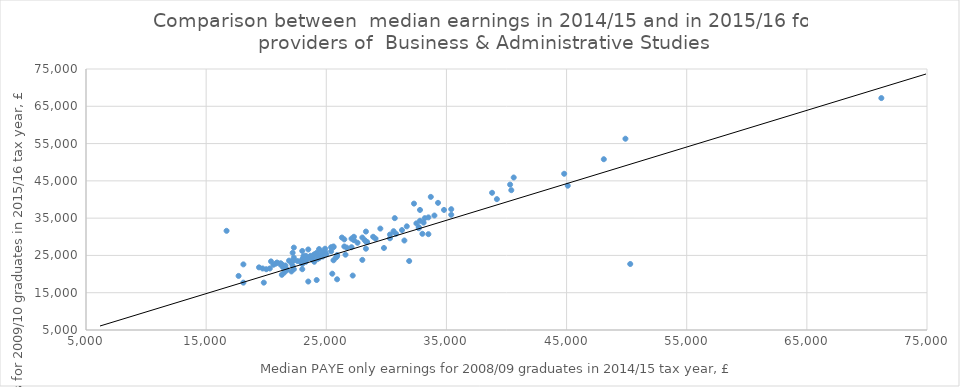
| Category | PAYE_median_rounded1516_TY |
|---|---|
| 0.0 | 0 |
| 0.0 | 0 |
| 0.0 | 0 |
| 0.0 | 0 |
| 0.0 | 0 |
| 0.0 | 0 |
| 0.0 | 0 |
| 0.0 | 0 |
| 0.0 | 0 |
| 0.0 | 0 |
| 0.0 | 0 |
| 0.0 | 0 |
| 0.0 | 0 |
| 0.0 | 0 |
| 0.0 | 0 |
| 0.0 | 0 |
| 0.0 | 0 |
| 0.0 | 0 |
| 0.0 | 0 |
| 0.0 | 0 |
| 0.0 | 0 |
| 0.0 | 0 |
| 0.0 | 0 |
| 0.0 | 0 |
| 0.0 | 0 |
| 0.0 | 0 |
| 0.0 | 0 |
| 0.0 | 0 |
| 0.0 | 0 |
| 0.0 | 0 |
| 0.0 | 0 |
| 0.0 | 0 |
| 0.0 | 0 |
| 0.0 | 0 |
| 0.0 | 0 |
| 0.0 | 0 |
| 0.0 | 0 |
| 0.0 | 0 |
| 0.0 | 0 |
| 0.0 | 0 |
| 0.0 | 0 |
| 0.0 | 0 |
| 0.0 | 0 |
| 0.0 | 0 |
| 0.0 | 0 |
| 0.0 | 0 |
| 0.0 | 0 |
| 0.0 | 0 |
| 0.0 | 0 |
| 0.0 | 0 |
| 0.0 | 0 |
| 0.0 | 0 |
| 0.0 | 0 |
| 0.0 | 0 |
| 0.0 | 0 |
| 0.0 | 0 |
| 0.0 | 0 |
| 0.0 | 0 |
| 0.0 | 0 |
| 0.0 | 0 |
| 0.0 | 0 |
| 0.0 | 0 |
| 0.0 | 0 |
| 0.0 | 0 |
| 0.0 | 0 |
| 0.0 | 0 |
| 0.0 | 0 |
| 0.0 | 0 |
| 0.0 | 0 |
| 0.0 | 0 |
| 0.0 | 0 |
| 0.0 | 0 |
| 0.0 | 0 |
| 0.0 | 0 |
| 0.0 | 0 |
| 0.0 | 0 |
| 0.0 | 0 |
| 0.0 | 0 |
| 0.0 | 0 |
| 0.0 | 0 |
| 0.0 | 0 |
| 0.0 | 0 |
| 0.0 | 0 |
| 0.0 | 0 |
| 0.0 | 0 |
| 0.0 | 0 |
| 0.0 | 0 |
| 0.0 | 0 |
| 0.0 | 0 |
| 0.0 | 0 |
| 0.0 | 0 |
| 0.0 | 0 |
| 0.0 | 0 |
| 0.0 | 0 |
| 0.0 | 0 |
| 0.0 | 0 |
| 0.0 | 0 |
| 0.0 | 0 |
| 0.0 | 0 |
| 0.0 | 0 |
| 0.0 | 0 |
| 0.0 | 0 |
| 0.0 | 0 |
| 0.0 | 0 |
| 0.0 | 0 |
| 0.0 | 0 |
| 0.0 | 0 |
| 0.0 | 0 |
| 0.0 | 0 |
| 0.0 | 0 |
| 0.0 | 0 |
| 0.0 | 0 |
| 0.0 | 0 |
| 0.0 | 0 |
| 0.0 | 0 |
| 0.0 | 0 |
| 0.0 | 0 |
| 0.0 | 0 |
| 0.0 | 0 |
| 0.0 | 0 |
| 0.0 | 0 |
| 0.0 | 0 |
| 0.0 | 0 |
| 0.0 | 0 |
| 0.0 | 0 |
| 0.0 | 0 |
| 0.0 | 0 |
| 0.0 | 0 |
| 0.0 | 0 |
| 0.0 | 0 |
| 0.0 | 0 |
| 0.0 | 0 |
| 0.0 | 0 |
| 0.0 | 0 |
| 0.0 | 0 |
| 0.0 | 0 |
| 0.0 | 0 |
| 0.0 | 0 |
| 0.0 | 0 |
| 0.0 | 0 |
| 0.0 | 0 |
| 0.0 | 0 |
| 0.0 | 0 |
| 0.0 | 0 |
| 0.0 | 0 |
| 0.0 | 0 |
| 0.0 | 0 |
| 0.0 | 0 |
| 0.0 | 0 |
| 0.0 | 0 |
| 0.0 | 0 |
| 0.0 | 0 |
| 0.0 | 0 |
| 0.0 | 0 |
| 0.0 | 0 |
| 0.0 | 0 |
| 0.0 | 0 |
| 0.0 | 0 |
| 0.0 | 0 |
| 0.0 | 0 |
| 0.0 | 0 |
| 0.0 | 0 |
| 0.0 | 0 |
| 0.0 | 0 |
| 0.0 | 0 |
| 0.0 | 0 |
| 0.0 | 0 |
| 0.0 | 0 |
| 0.0 | 0 |
| 0.0 | 0 |
| 0.0 | 0 |
| 0.0 | 0 |
| 0.0 | 0 |
| 0.0 | 0 |
| 0.0 | 0 |
| 0.0 | 0 |
| 0.0 | 0 |
| 0.0 | 0 |
| 0.0 | 0 |
| 0.0 | 0 |
| 0.0 | 0 |
| 0.0 | 0 |
| 0.0 | 0 |
| 0.0 | 0 |
| 0.0 | 0 |
| 23700.0 | 24900 |
| 24600.0 | 25500 |
| 23500.0 | 26600 |
| 20800.0 | 22800 |
| 23500.0 | 18000 |
| 22300.0 | 21300 |
| 24200.0 | 18400 |
| 30600.0 | 31500 |
| 23000.0 | 21300 |
| 30300.0 | 29600 |
| 28900.0 | 30000 |
| 24300.0 | 24100 |
| 25800.0 | 24400 |
| 25600.0 | 27400 |
| 31900.0 | 23500 |
| 40400.0 | 42500 |
| 23900.0 | 24400 |
| 23800.0 | 23900 |
| 21700.0 | 21000 |
| 28000.0 | 23800 |
| 25900.0 | 18600 |
| 25600.0 | 23700 |
| 35400.0 | 37400 |
| 26700.0 | 27100 |
| 20000.0 | 21300 |
| 24300.0 | 25100 |
| 23300.0 | 24900 |
| 18100.0 | 22600 |
| 22600.0 | 23500 |
| 23000.0 | 23600 |
| 48100.0 | 50800 |
| 22100.0 | 23000 |
| 50300.0 | 22700 |
| 40600.0 | 45900 |
| 24400.0 | 24300 |
| 22300.0 | 23700 |
| 23500.0 | 24300 |
| 16700.0 | 31600 |
| 26600.0 | 25200 |
| 28000.0 | 29800 |
| 31300.0 | 31800 |
| 21200.0 | 22900 |
| 31500.0 | 29000 |
| 27300.0 | 29100 |
| 32700.0 | 32600 |
| 27200.0 | 19600 |
| 24700.0 | 24700 |
| 24000.0 | 25300 |
| 22300.0 | 24400 |
| 23300.0 | 24200 |
| 32800.0 | 37200 |
| 19800.0 | 17700 |
| 28400.0 | 28600 |
| 22200.0 | 25700 |
| 22300.0 | 27100 |
| 23000.0 | 24000 |
| 24200.0 | 25700 |
| 21900.0 | 23600 |
| 20600.0 | 22500 |
| 30700.0 | 35000 |
| 20300.0 | 21500 |
| 25400.0 | 27200 |
| 23100.0 | 24800 |
| 26500.0 | 27400 |
| 22900.0 | 23100 |
| 24700.0 | 26000 |
| 30800.0 | 30800 |
| 24400.0 | 26700 |
| 21600.0 | 22300 |
| 39200.0 | 40100 |
| 29100.0 | 29500 |
| 20900.0 | 23100 |
| 32700.0 | 32300 |
| 34300.0 | 39100 |
| 23300.0 | 23300 |
| 31700.0 | 32800 |
| 21700.0 | 21300 |
| 28300.0 | 26800 |
| 45100.0 | 43700 |
| 28200.0 | 29100 |
| 24900.0 | 26000 |
| 19400.0 | 21800 |
| 25500.0 | 20100 |
| 35400.0 | 35900 |
| 33200.0 | 35000 |
| 25900.0 | 25100 |
| 27100.0 | 27200 |
| 26300.0 | 29800 |
| 33100.0 | 33800 |
| 25600.0 | 27200 |
| 29500.0 | 32200 |
| 71200.0 | 67200 |
| 30300.0 | 30600 |
| 24900.0 | 26800 |
| 28300.0 | 31400 |
| 21300.0 | 19800 |
| 40300.0 | 44000 |
| 49900.0 | 56300 |
| 27600.0 | 28400 |
| 34000.0 | 35700 |
| 29800.0 | 27000 |
| 32300.0 | 38900 |
| 23000.0 | 22700 |
| 32800.0 | 34300 |
| 34800.0 | 37200 |
| 27300.0 | 30000 |
| 33500.0 | 35200 |
| 32500.0 | 33600 |
| 22200.0 | 22200 |
| 25000.0 | 25300 |
| 38800.0 | 41800 |
| 33700.0 | 40700 |
| 25900.0 | 24800 |
| 28300.0 | 28700 |
| 33500.0 | 30700 |
| 33000.0 | 30800 |
| 21500.0 | 20400 |
| 19700.0 | 21500 |
| 23000.0 | 26200 |
| 23300.0 | 24000 |
| 21400.0 | 21800 |
| 44800.0 | 46900 |
| 21300.0 | 22600 |
| 26500.0 | 29300 |
| 22200.0 | 23500 |
| 25400.0 | 26100 |
| 24000.0 | 23300 |
| 21200.0 | 22500 |
| 22100.0 | 20700 |
| 18100.0 | 17700 |
| 20400.0 | 23400 |
| 17700.0 | 19500 |
| 27100.0 | 29500 |
| 0.0 | 0 |
| 0.0 | 0 |
| 0.0 | 0 |
| 0.0 | 0 |
| 0.0 | 0 |
| 0.0 | 0 |
| 0.0 | 0 |
| 0.0 | 0 |
| 0.0 | 0 |
| 0.0 | 0 |
| 0.0 | 0 |
| 0.0 | 0 |
| 0.0 | 0 |
| 0.0 | 0 |
| 0.0 | 0 |
| 0.0 | 0 |
| 0.0 | 0 |
| 0.0 | 0 |
| 0.0 | 0 |
| 0.0 | 0 |
| 0.0 | 0 |
| 0.0 | 0 |
| 0.0 | 0 |
| 0.0 | 0 |
| 0.0 | 0 |
| 0.0 | 0 |
| 0.0 | 0 |
| 0.0 | 0 |
| 0.0 | 0 |
| 0.0 | 0 |
| 0.0 | 0 |
| 0.0 | 0 |
| 0.0 | 0 |
| 0.0 | 0 |
| 0.0 | 0 |
| 0.0 | 0 |
| 0.0 | 0 |
| 0.0 | 0 |
| 0.0 | 0 |
| 0.0 | 0 |
| 0.0 | 0 |
| 0.0 | 0 |
| 0.0 | 0 |
| 0.0 | 0 |
| 0.0 | 0 |
| 0.0 | 0 |
| 0.0 | 0 |
| 0.0 | 0 |
| 0.0 | 0 |
| 0.0 | 0 |
| 0.0 | 0 |
| 0.0 | 0 |
| 0.0 | 0 |
| 0.0 | 0 |
| 0.0 | 0 |
| 0.0 | 0 |
| 0.0 | 0 |
| 0.0 | 0 |
| 0.0 | 0 |
| 0.0 | 0 |
| 0.0 | 0 |
| 0.0 | 0 |
| 0.0 | 0 |
| 0.0 | 0 |
| 0.0 | 0 |
| 0.0 | 0 |
| 0.0 | 0 |
| 0.0 | 0 |
| 0.0 | 0 |
| 0.0 | 0 |
| 0.0 | 0 |
| 0.0 | 0 |
| 0.0 | 0 |
| 0.0 | 0 |
| 0.0 | 0 |
| 0.0 | 0 |
| 0.0 | 0 |
| 0.0 | 0 |
| 0.0 | 0 |
| 0.0 | 0 |
| 0.0 | 0 |
| 0.0 | 0 |
| 0.0 | 0 |
| 0.0 | 0 |
| 0.0 | 0 |
| 0.0 | 0 |
| 0.0 | 0 |
| 0.0 | 0 |
| 0.0 | 0 |
| 0.0 | 0 |
| 0.0 | 0 |
| 0.0 | 0 |
| 0.0 | 0 |
| 0.0 | 0 |
| 0.0 | 0 |
| 0.0 | 0 |
| 0.0 | 0 |
| 0.0 | 0 |
| 0.0 | 0 |
| 0.0 | 0 |
| 0.0 | 0 |
| 0.0 | 0 |
| 0.0 | 0 |
| 0.0 | 0 |
| 0.0 | 0 |
| 0.0 | 0 |
| 0.0 | 0 |
| 0.0 | 0 |
| 0.0 | 0 |
| 0.0 | 0 |
| 0.0 | 0 |
| 0.0 | 0 |
| 0.0 | 0 |
| 0.0 | 0 |
| 0.0 | 0 |
| 0.0 | 0 |
| 0.0 | 0 |
| 0.0 | 0 |
| 0.0 | 0 |
| 0.0 | 0 |
| 0.0 | 0 |
| 0.0 | 0 |
| 0.0 | 0 |
| 0.0 | 0 |
| 0.0 | 0 |
| 0.0 | 0 |
| 0.0 | 0 |
| 0.0 | 0 |
| 0.0 | 0 |
| 0.0 | 0 |
| 0.0 | 0 |
| 0.0 | 0 |
| 0.0 | 0 |
| 0.0 | 0 |
| 0.0 | 0 |
| 0.0 | 0 |
| 0.0 | 0 |
| 0.0 | 0 |
| 0.0 | 0 |
| 0.0 | 0 |
| 0.0 | 0 |
| 0.0 | 0 |
| 0.0 | 0 |
| 0.0 | 0 |
| 0.0 | 0 |
| 0.0 | 0 |
| 0.0 | 0 |
| 0.0 | 0 |
| 0.0 | 0 |
| 0.0 | 0 |
| 0.0 | 0 |
| 0.0 | 0 |
| 0.0 | 0 |
| 0.0 | 0 |
| 0.0 | 0 |
| 0.0 | 0 |
| 0.0 | 0 |
| 0.0 | 0 |
| 0.0 | 0 |
| 0.0 | 0 |
| 0.0 | 0 |
| 0.0 | 0 |
| 0.0 | 0 |
| 0.0 | 0 |
| 0.0 | 0 |
| 0.0 | 0 |
| 0.0 | 0 |
| 0.0 | 0 |
| 0.0 | 0 |
| 0.0 | 0 |
| 0.0 | 0 |
| 0.0 | 0 |
| 0.0 | 0 |
| 0.0 | 0 |
| 0.0 | 0 |
| 0.0 | 0 |
| 0.0 | 0 |
| 0.0 | 0 |
| 0.0 | 0 |
| 0.0 | 0 |
| 0.0 | 0 |
| 0.0 | 0 |
| 0.0 | 0 |
| 0.0 | 0 |
| 0.0 | 0 |
| 0.0 | 0 |
| 0.0 | 0 |
| 0.0 | 0 |
| 0.0 | 0 |
| 0.0 | 0 |
| 0.0 | 0 |
| 0.0 | 0 |
| 0.0 | 0 |
| 0.0 | 0 |
| 0.0 | 0 |
| 0.0 | 0 |
| 0.0 | 0 |
| 0.0 | 0 |
| 0.0 | 0 |
| 0.0 | 0 |
| 0.0 | 0 |
| 0.0 | 0 |
| 0.0 | 0 |
| 0.0 | 0 |
| 0.0 | 0 |
| 0.0 | 0 |
| 0.0 | 0 |
| 0.0 | 0 |
| 0.0 | 0 |
| 0.0 | 0 |
| 0.0 | 0 |
| 0.0 | 0 |
| 0.0 | 0 |
| 0.0 | 0 |
| 0.0 | 0 |
| 0.0 | 0 |
| 0.0 | 0 |
| 0.0 | 0 |
| 0.0 | 0 |
| 0.0 | 0 |
| 0.0 | 0 |
| 0.0 | 0 |
| 0.0 | 0 |
| 0.0 | 0 |
| 0.0 | 0 |
| 0.0 | 0 |
| 0.0 | 0 |
| 0.0 | 0 |
| 0.0 | 0 |
| 0.0 | 0 |
| 0.0 | 0 |
| 0.0 | 0 |
| 0.0 | 0 |
| 0.0 | 0 |
| 0.0 | 0 |
| 0.0 | 0 |
| 0.0 | 0 |
| 0.0 | 0 |
| 0.0 | 0 |
| 0.0 | 0 |
| 0.0 | 0 |
| 0.0 | 0 |
| 0.0 | 0 |
| 0.0 | 0 |
| 0.0 | 0 |
| 0.0 | 0 |
| 0.0 | 0 |
| 0.0 | 0 |
| 0.0 | 0 |
| 0.0 | 0 |
| 0.0 | 0 |
| 0.0 | 0 |
| 0.0 | 0 |
| 0.0 | 0 |
| 0.0 | 0 |
| 0.0 | 0 |
| 0.0 | 0 |
| 0.0 | 0 |
| 0.0 | 0 |
| 0.0 | 0 |
| 0.0 | 0 |
| 0.0 | 0 |
| 0.0 | 0 |
| 0.0 | 0 |
| 0.0 | 0 |
| 0.0 | 0 |
| 0.0 | 0 |
| 0.0 | 0 |
| 0.0 | 0 |
| 0.0 | 0 |
| 0.0 | 0 |
| 0.0 | 0 |
| 0.0 | 0 |
| 0.0 | 0 |
| 0.0 | 0 |
| 0.0 | 0 |
| 0.0 | 0 |
| 0.0 | 0 |
| 0.0 | 0 |
| 0.0 | 0 |
| 0.0 | 0 |
| 0.0 | 0 |
| 0.0 | 0 |
| 0.0 | 0 |
| 0.0 | 0 |
| 0.0 | 0 |
| 0.0 | 0 |
| 0.0 | 0 |
| 0.0 | 0 |
| 0.0 | 0 |
| 0.0 | 0 |
| 0.0 | 0 |
| 0.0 | 0 |
| 0.0 | 0 |
| 0.0 | 0 |
| 0.0 | 0 |
| 0.0 | 0 |
| 0.0 | 0 |
| 0.0 | 0 |
| 0.0 | 0 |
| 0.0 | 0 |
| 0.0 | 0 |
| 0.0 | 0 |
| 0.0 | 0 |
| 0.0 | 0 |
| 0.0 | 0 |
| 0.0 | 0 |
| 0.0 | 0 |
| 0.0 | 0 |
| 0.0 | 0 |
| 0.0 | 0 |
| 0.0 | 0 |
| 0.0 | 0 |
| 0.0 | 0 |
| 0.0 | 0 |
| 0.0 | 0 |
| 0.0 | 0 |
| 0.0 | 0 |
| 0.0 | 0 |
| 0.0 | 0 |
| 0.0 | 0 |
| 0.0 | 0 |
| 0.0 | 0 |
| 0.0 | 0 |
| 0.0 | 0 |
| 0.0 | 0 |
| 0.0 | 0 |
| 0.0 | 0 |
| 0.0 | 0 |
| 0.0 | 0 |
| 0.0 | 0 |
| 0.0 | 0 |
| 0.0 | 0 |
| 0.0 | 0 |
| 0.0 | 0 |
| 0.0 | 0 |
| 0.0 | 0 |
| 0.0 | 0 |
| 0.0 | 0 |
| 0.0 | 0 |
| 0.0 | 0 |
| 0.0 | 0 |
| 0.0 | 0 |
| 0.0 | 0 |
| 0.0 | 0 |
| 0.0 | 0 |
| 0.0 | 0 |
| 0.0 | 0 |
| 0.0 | 0 |
| 0.0 | 0 |
| 0.0 | 0 |
| 0.0 | 0 |
| 0.0 | 0 |
| 0.0 | 0 |
| 0.0 | 0 |
| 0.0 | 0 |
| 0.0 | 0 |
| 0.0 | 0 |
| 0.0 | 0 |
| 0.0 | 0 |
| 0.0 | 0 |
| 0.0 | 0 |
| 0.0 | 0 |
| 0.0 | 0 |
| 0.0 | 0 |
| 0.0 | 0 |
| 0.0 | 0 |
| 0.0 | 0 |
| 0.0 | 0 |
| 0.0 | 0 |
| 0.0 | 0 |
| 0.0 | 0 |
| 0.0 | 0 |
| 0.0 | 0 |
| 0.0 | 0 |
| 0.0 | 0 |
| 0.0 | 0 |
| 0.0 | 0 |
| 0.0 | 0 |
| 0.0 | 0 |
| 0.0 | 0 |
| 0.0 | 0 |
| 0.0 | 0 |
| 0.0 | 0 |
| 0.0 | 0 |
| 0.0 | 0 |
| 0.0 | 0 |
| 0.0 | 0 |
| 0.0 | 0 |
| 0.0 | 0 |
| 0.0 | 0 |
| 0.0 | 0 |
| 0.0 | 0 |
| 0.0 | 0 |
| 0.0 | 0 |
| 0.0 | 0 |
| 0.0 | 0 |
| 0.0 | 0 |
| 0.0 | 0 |
| 0.0 | 0 |
| 0.0 | 0 |
| 0.0 | 0 |
| 0.0 | 0 |
| 0.0 | 0 |
| 0.0 | 0 |
| 0.0 | 0 |
| 0.0 | 0 |
| 0.0 | 0 |
| 0.0 | 0 |
| 0.0 | 0 |
| 0.0 | 0 |
| 0.0 | 0 |
| 0.0 | 0 |
| 0.0 | 0 |
| 0.0 | 0 |
| 0.0 | 0 |
| 0.0 | 0 |
| 0.0 | 0 |
| 0.0 | 0 |
| 0.0 | 0 |
| 0.0 | 0 |
| 0.0 | 0 |
| 0.0 | 0 |
| 0.0 | 0 |
| 0.0 | 0 |
| 0.0 | 0 |
| 0.0 | 0 |
| 0.0 | 0 |
| 0.0 | 0 |
| 0.0 | 0 |
| 0.0 | 0 |
| 0.0 | 0 |
| 0.0 | 0 |
| 0.0 | 0 |
| 0.0 | 0 |
| 0.0 | 0 |
| 0.0 | 0 |
| 0.0 | 0 |
| 0.0 | 0 |
| 0.0 | 0 |
| 0.0 | 0 |
| 0.0 | 0 |
| 0.0 | 0 |
| 0.0 | 0 |
| 0.0 | 0 |
| 0.0 | 0 |
| 0.0 | 0 |
| 0.0 | 0 |
| 0.0 | 0 |
| 0.0 | 0 |
| 0.0 | 0 |
| 0.0 | 0 |
| 0.0 | 0 |
| 0.0 | 0 |
| 0.0 | 0 |
| 0.0 | 0 |
| 0.0 | 0 |
| 0.0 | 0 |
| 0.0 | 0 |
| 0.0 | 0 |
| 0.0 | 0 |
| 0.0 | 0 |
| 0.0 | 0 |
| 0.0 | 0 |
| 0.0 | 0 |
| 0.0 | 0 |
| 0.0 | 0 |
| 0.0 | 0 |
| 0.0 | 0 |
| 0.0 | 0 |
| 0.0 | 0 |
| 0.0 | 0 |
| 0.0 | 0 |
| 0.0 | 0 |
| 0.0 | 0 |
| 0.0 | 0 |
| 0.0 | 0 |
| 0.0 | 0 |
| 0.0 | 0 |
| 0.0 | 0 |
| 0.0 | 0 |
| 0.0 | 0 |
| 0.0 | 0 |
| 0.0 | 0 |
| 0.0 | 0 |
| 0.0 | 0 |
| 0.0 | 0 |
| 0.0 | 0 |
| 0.0 | 0 |
| 0.0 | 0 |
| 0.0 | 0 |
| 0.0 | 0 |
| 0.0 | 0 |
| 0.0 | 0 |
| 0.0 | 0 |
| 0.0 | 0 |
| 0.0 | 0 |
| 0.0 | 0 |
| 0.0 | 0 |
| 0.0 | 0 |
| 0.0 | 0 |
| 0.0 | 0 |
| 0.0 | 0 |
| 0.0 | 0 |
| 0.0 | 0 |
| 0.0 | 0 |
| 0.0 | 0 |
| 0.0 | 0 |
| 0.0 | 0 |
| 0.0 | 0 |
| 0.0 | 0 |
| 0.0 | 0 |
| 0.0 | 0 |
| 0.0 | 0 |
| 0.0 | 0 |
| 0.0 | 0 |
| 0.0 | 0 |
| 0.0 | 0 |
| 0.0 | 0 |
| 0.0 | 0 |
| 0.0 | 0 |
| 0.0 | 0 |
| 0.0 | 0 |
| 0.0 | 0 |
| 0.0 | 0 |
| 0.0 | 0 |
| 0.0 | 0 |
| 0.0 | 0 |
| 0.0 | 0 |
| 0.0 | 0 |
| 0.0 | 0 |
| 0.0 | 0 |
| 0.0 | 0 |
| 0.0 | 0 |
| 0.0 | 0 |
| 0.0 | 0 |
| 0.0 | 0 |
| 0.0 | 0 |
| 0.0 | 0 |
| 0.0 | 0 |
| 0.0 | 0 |
| 0.0 | 0 |
| 0.0 | 0 |
| 0.0 | 0 |
| 0.0 | 0 |
| 0.0 | 0 |
| 0.0 | 0 |
| 0.0 | 0 |
| 0.0 | 0 |
| 0.0 | 0 |
| 0.0 | 0 |
| 0.0 | 0 |
| 0.0 | 0 |
| 0.0 | 0 |
| 0.0 | 0 |
| 0.0 | 0 |
| 0.0 | 0 |
| 0.0 | 0 |
| 0.0 | 0 |
| 0.0 | 0 |
| 0.0 | 0 |
| 0.0 | 0 |
| 0.0 | 0 |
| 0.0 | 0 |
| 0.0 | 0 |
| 0.0 | 0 |
| 0.0 | 0 |
| 0.0 | 0 |
| 0.0 | 0 |
| 0.0 | 0 |
| 0.0 | 0 |
| 0.0 | 0 |
| 0.0 | 0 |
| 0.0 | 0 |
| 0.0 | 0 |
| 0.0 | 0 |
| 0.0 | 0 |
| 0.0 | 0 |
| 0.0 | 0 |
| 0.0 | 0 |
| 0.0 | 0 |
| 0.0 | 0 |
| 0.0 | 0 |
| 0.0 | 0 |
| 0.0 | 0 |
| 0.0 | 0 |
| 0.0 | 0 |
| 0.0 | 0 |
| 0.0 | 0 |
| 0.0 | 0 |
| 0.0 | 0 |
| 0.0 | 0 |
| 0.0 | 0 |
| 0.0 | 0 |
| 0.0 | 0 |
| 0.0 | 0 |
| 0.0 | 0 |
| 0.0 | 0 |
| 0.0 | 0 |
| 0.0 | 0 |
| 0.0 | 0 |
| 0.0 | 0 |
| 0.0 | 0 |
| 0.0 | 0 |
| 0.0 | 0 |
| 0.0 | 0 |
| 0.0 | 0 |
| 0.0 | 0 |
| 0.0 | 0 |
| 0.0 | 0 |
| 0.0 | 0 |
| 0.0 | 0 |
| 0.0 | 0 |
| 0.0 | 0 |
| 0.0 | 0 |
| 0.0 | 0 |
| 0.0 | 0 |
| 0.0 | 0 |
| 0.0 | 0 |
| 0.0 | 0 |
| 0.0 | 0 |
| 0.0 | 0 |
| 0.0 | 0 |
| 0.0 | 0 |
| 0.0 | 0 |
| 0.0 | 0 |
| 0.0 | 0 |
| 0.0 | 0 |
| 0.0 | 0 |
| 0.0 | 0 |
| 0.0 | 0 |
| 0.0 | 0 |
| 0.0 | 0 |
| 0.0 | 0 |
| 0.0 | 0 |
| 0.0 | 0 |
| 0.0 | 0 |
| 0.0 | 0 |
| 0.0 | 0 |
| 0.0 | 0 |
| 0.0 | 0 |
| 0.0 | 0 |
| 0.0 | 0 |
| 0.0 | 0 |
| 0.0 | 0 |
| 0.0 | 0 |
| 0.0 | 0 |
| 0.0 | 0 |
| 0.0 | 0 |
| 0.0 | 0 |
| 0.0 | 0 |
| 0.0 | 0 |
| 0.0 | 0 |
| 0.0 | 0 |
| 0.0 | 0 |
| 0.0 | 0 |
| 0.0 | 0 |
| 0.0 | 0 |
| 0.0 | 0 |
| 0.0 | 0 |
| 0.0 | 0 |
| 0.0 | 0 |
| 0.0 | 0 |
| 0.0 | 0 |
| 0.0 | 0 |
| 0.0 | 0 |
| 0.0 | 0 |
| 0.0 | 0 |
| 0.0 | 0 |
| 0.0 | 0 |
| 0.0 | 0 |
| 0.0 | 0 |
| 0.0 | 0 |
| 0.0 | 0 |
| 0.0 | 0 |
| 0.0 | 0 |
| 0.0 | 0 |
| 0.0 | 0 |
| 0.0 | 0 |
| 0.0 | 0 |
| 0.0 | 0 |
| 0.0 | 0 |
| 0.0 | 0 |
| 0.0 | 0 |
| 0.0 | 0 |
| 0.0 | 0 |
| 0.0 | 0 |
| 0.0 | 0 |
| 0.0 | 0 |
| 0.0 | 0 |
| 0.0 | 0 |
| 0.0 | 0 |
| 0.0 | 0 |
| 0.0 | 0 |
| 0.0 | 0 |
| 0.0 | 0 |
| 0.0 | 0 |
| 0.0 | 0 |
| 0.0 | 0 |
| 0.0 | 0 |
| 0.0 | 0 |
| 0.0 | 0 |
| 0.0 | 0 |
| 0.0 | 0 |
| 0.0 | 0 |
| 0.0 | 0 |
| 0.0 | 0 |
| 0.0 | 0 |
| 0.0 | 0 |
| 0.0 | 0 |
| 0.0 | 0 |
| 0.0 | 0 |
| 0.0 | 0 |
| 0.0 | 0 |
| 0.0 | 0 |
| 0.0 | 0 |
| 0.0 | 0 |
| 0.0 | 0 |
| 0.0 | 0 |
| 0.0 | 0 |
| 0.0 | 0 |
| 0.0 | 0 |
| 0.0 | 0 |
| 0.0 | 0 |
| 0.0 | 0 |
| 0.0 | 0 |
| 0.0 | 0 |
| 0.0 | 0 |
| 0.0 | 0 |
| 0.0 | 0 |
| 0.0 | 0 |
| 0.0 | 0 |
| 0.0 | 0 |
| 0.0 | 0 |
| 0.0 | 0 |
| 0.0 | 0 |
| 0.0 | 0 |
| 0.0 | 0 |
| 0.0 | 0 |
| 0.0 | 0 |
| 0.0 | 0 |
| 0.0 | 0 |
| 0.0 | 0 |
| 0.0 | 0 |
| 0.0 | 0 |
| 0.0 | 0 |
| 0.0 | 0 |
| 0.0 | 0 |
| 0.0 | 0 |
| 0.0 | 0 |
| 0.0 | 0 |
| 0.0 | 0 |
| 0.0 | 0 |
| 0.0 | 0 |
| 0.0 | 0 |
| 0.0 | 0 |
| 0.0 | 0 |
| 0.0 | 0 |
| 0.0 | 0 |
| 0.0 | 0 |
| 0.0 | 0 |
| 0.0 | 0 |
| 0.0 | 0 |
| 0.0 | 0 |
| 0.0 | 0 |
| 0.0 | 0 |
| 0.0 | 0 |
| 0.0 | 0 |
| 0.0 | 0 |
| 0.0 | 0 |
| 0.0 | 0 |
| 0.0 | 0 |
| 0.0 | 0 |
| 0.0 | 0 |
| 0.0 | 0 |
| 0.0 | 0 |
| 0.0 | 0 |
| 0.0 | 0 |
| 0.0 | 0 |
| 0.0 | 0 |
| 0.0 | 0 |
| 0.0 | 0 |
| 0.0 | 0 |
| 0.0 | 0 |
| 0.0 | 0 |
| 0.0 | 0 |
| 0.0 | 0 |
| 0.0 | 0 |
| 0.0 | 0 |
| 0.0 | 0 |
| 0.0 | 0 |
| 0.0 | 0 |
| 0.0 | 0 |
| 0.0 | 0 |
| 0.0 | 0 |
| 0.0 | 0 |
| 0.0 | 0 |
| 0.0 | 0 |
| 0.0 | 0 |
| 0.0 | 0 |
| 0.0 | 0 |
| 0.0 | 0 |
| 0.0 | 0 |
| 0.0 | 0 |
| 0.0 | 0 |
| 0.0 | 0 |
| 0.0 | 0 |
| 0.0 | 0 |
| 0.0 | 0 |
| 0.0 | 0 |
| 0.0 | 0 |
| 0.0 | 0 |
| 0.0 | 0 |
| 0.0 | 0 |
| 0.0 | 0 |
| 0.0 | 0 |
| 0.0 | 0 |
| 0.0 | 0 |
| 0.0 | 0 |
| 0.0 | 0 |
| 0.0 | 0 |
| 0.0 | 0 |
| 0.0 | 0 |
| 0.0 | 0 |
| 0.0 | 0 |
| 0.0 | 0 |
| 0.0 | 0 |
| 0.0 | 0 |
| 0.0 | 0 |
| 0.0 | 0 |
| 0.0 | 0 |
| 0.0 | 0 |
| 0.0 | 0 |
| 0.0 | 0 |
| 0.0 | 0 |
| 0.0 | 0 |
| 0.0 | 0 |
| 0.0 | 0 |
| 0.0 | 0 |
| 0.0 | 0 |
| 0.0 | 0 |
| 0.0 | 0 |
| 0.0 | 0 |
| 0.0 | 0 |
| 0.0 | 0 |
| 0.0 | 0 |
| 0.0 | 0 |
| 0.0 | 0 |
| 0.0 | 0 |
| 0.0 | 0 |
| 0.0 | 0 |
| 0.0 | 0 |
| 0.0 | 0 |
| 0.0 | 0 |
| 0.0 | 0 |
| 0.0 | 0 |
| 0.0 | 0 |
| 0.0 | 0 |
| 0.0 | 0 |
| 0.0 | 0 |
| 0.0 | 0 |
| 0.0 | 0 |
| 0.0 | 0 |
| 0.0 | 0 |
| 0.0 | 0 |
| 0.0 | 0 |
| 0.0 | 0 |
| 0.0 | 0 |
| 0.0 | 0 |
| 0.0 | 0 |
| 0.0 | 0 |
| 0.0 | 0 |
| 0.0 | 0 |
| 0.0 | 0 |
| 0.0 | 0 |
| 0.0 | 0 |
| 0.0 | 0 |
| 0.0 | 0 |
| 0.0 | 0 |
| 0.0 | 0 |
| 0.0 | 0 |
| 0.0 | 0 |
| 0.0 | 0 |
| 0.0 | 0 |
| 0.0 | 0 |
| 0.0 | 0 |
| 0.0 | 0 |
| 0.0 | 0 |
| 0.0 | 0 |
| 0.0 | 0 |
| 0.0 | 0 |
| 0.0 | 0 |
| 0.0 | 0 |
| 0.0 | 0 |
| 0.0 | 0 |
| 0.0 | 0 |
| 0.0 | 0 |
| 0.0 | 0 |
| 0.0 | 0 |
| 0.0 | 0 |
| 0.0 | 0 |
| 0.0 | 0 |
| 0.0 | 0 |
| 0.0 | 0 |
| 0.0 | 0 |
| 0.0 | 0 |
| 0.0 | 0 |
| 0.0 | 0 |
| 0.0 | 0 |
| 0.0 | 0 |
| 0.0 | 0 |
| 0.0 | 0 |
| 0.0 | 0 |
| 0.0 | 0 |
| 0.0 | 0 |
| 0.0 | 0 |
| 0.0 | 0 |
| 0.0 | 0 |
| 0.0 | 0 |
| 0.0 | 0 |
| 0.0 | 0 |
| 0.0 | 0 |
| 0.0 | 0 |
| 0.0 | 0 |
| 0.0 | 0 |
| 0.0 | 0 |
| 0.0 | 0 |
| 0.0 | 0 |
| 0.0 | 0 |
| 0.0 | 0 |
| 0.0 | 0 |
| 0.0 | 0 |
| 0.0 | 0 |
| 0.0 | 0 |
| 0.0 | 0 |
| 0.0 | 0 |
| 0.0 | 0 |
| 0.0 | 0 |
| 0.0 | 0 |
| 0.0 | 0 |
| 0.0 | 0 |
| 0.0 | 0 |
| 0.0 | 0 |
| 0.0 | 0 |
| 0.0 | 0 |
| 0.0 | 0 |
| 0.0 | 0 |
| 0.0 | 0 |
| 0.0 | 0 |
| 0.0 | 0 |
| 0.0 | 0 |
| 0.0 | 0 |
| 0.0 | 0 |
| 0.0 | 0 |
| 0.0 | 0 |
| 0.0 | 0 |
| 0.0 | 0 |
| 0.0 | 0 |
| 0.0 | 0 |
| 0.0 | 0 |
| 0.0 | 0 |
| 0.0 | 0 |
| 0.0 | 0 |
| 0.0 | 0 |
| 0.0 | 0 |
| 0.0 | 0 |
| 0.0 | 0 |
| 0.0 | 0 |
| 0.0 | 0 |
| 0.0 | 0 |
| 0.0 | 0 |
| 0.0 | 0 |
| 0.0 | 0 |
| 0.0 | 0 |
| 0.0 | 0 |
| 0.0 | 0 |
| 0.0 | 0 |
| 0.0 | 0 |
| 0.0 | 0 |
| 0.0 | 0 |
| 0.0 | 0 |
| 0.0 | 0 |
| 0.0 | 0 |
| 0.0 | 0 |
| 0.0 | 0 |
| 0.0 | 0 |
| 0.0 | 0 |
| 0.0 | 0 |
| 0.0 | 0 |
| 0.0 | 0 |
| 0.0 | 0 |
| 0.0 | 0 |
| 0.0 | 0 |
| 0.0 | 0 |
| 0.0 | 0 |
| 0.0 | 0 |
| 0.0 | 0 |
| 0.0 | 0 |
| 0.0 | 0 |
| 0.0 | 0 |
| 0.0 | 0 |
| 0.0 | 0 |
| 0.0 | 0 |
| 0.0 | 0 |
| 0.0 | 0 |
| 0.0 | 0 |
| 0.0 | 0 |
| 0.0 | 0 |
| 0.0 | 0 |
| 0.0 | 0 |
| 0.0 | 0 |
| 0.0 | 0 |
| 0.0 | 0 |
| 0.0 | 0 |
| 0.0 | 0 |
| 0.0 | 0 |
| 0.0 | 0 |
| 0.0 | 0 |
| 0.0 | 0 |
| 0.0 | 0 |
| 0.0 | 0 |
| 0.0 | 0 |
| 0.0 | 0 |
| 0.0 | 0 |
| 0.0 | 0 |
| 0.0 | 0 |
| 0.0 | 0 |
| 0.0 | 0 |
| 0.0 | 0 |
| 0.0 | 0 |
| 0.0 | 0 |
| 0.0 | 0 |
| 0.0 | 0 |
| 0.0 | 0 |
| 0.0 | 0 |
| 0.0 | 0 |
| 0.0 | 0 |
| 0.0 | 0 |
| 0.0 | 0 |
| 0.0 | 0 |
| 0.0 | 0 |
| 0.0 | 0 |
| 0.0 | 0 |
| 0.0 | 0 |
| 0.0 | 0 |
| 0.0 | 0 |
| 0.0 | 0 |
| 0.0 | 0 |
| 0.0 | 0 |
| 0.0 | 0 |
| 0.0 | 0 |
| 0.0 | 0 |
| 0.0 | 0 |
| 0.0 | 0 |
| 0.0 | 0 |
| 0.0 | 0 |
| 0.0 | 0 |
| 0.0 | 0 |
| 0.0 | 0 |
| 0.0 | 0 |
| 0.0 | 0 |
| 0.0 | 0 |
| 0.0 | 0 |
| 0.0 | 0 |
| 0.0 | 0 |
| 0.0 | 0 |
| 0.0 | 0 |
| 0.0 | 0 |
| 0.0 | 0 |
| 0.0 | 0 |
| 0.0 | 0 |
| 0.0 | 0 |
| 0.0 | 0 |
| 0.0 | 0 |
| 0.0 | 0 |
| 0.0 | 0 |
| 0.0 | 0 |
| 0.0 | 0 |
| 0.0 | 0 |
| 0.0 | 0 |
| 0.0 | 0 |
| 0.0 | 0 |
| 0.0 | 0 |
| 0.0 | 0 |
| 0.0 | 0 |
| 0.0 | 0 |
| 0.0 | 0 |
| 0.0 | 0 |
| 0.0 | 0 |
| 0.0 | 0 |
| 0.0 | 0 |
| 0.0 | 0 |
| 0.0 | 0 |
| 0.0 | 0 |
| 0.0 | 0 |
| 0.0 | 0 |
| 0.0 | 0 |
| 0.0 | 0 |
| 0.0 | 0 |
| 0.0 | 0 |
| 0.0 | 0 |
| 0.0 | 0 |
| 0.0 | 0 |
| 0.0 | 0 |
| 0.0 | 0 |
| 0.0 | 0 |
| 0.0 | 0 |
| 0.0 | 0 |
| 0.0 | 0 |
| 0.0 | 0 |
| 0.0 | 0 |
| 0.0 | 0 |
| 0.0 | 0 |
| 0.0 | 0 |
| 0.0 | 0 |
| 0.0 | 0 |
| 0.0 | 0 |
| 0.0 | 0 |
| 0.0 | 0 |
| 0.0 | 0 |
| 0.0 | 0 |
| 0.0 | 0 |
| 0.0 | 0 |
| 0.0 | 0 |
| 0.0 | 0 |
| 0.0 | 0 |
| 0.0 | 0 |
| 0.0 | 0 |
| 0.0 | 0 |
| 0.0 | 0 |
| 0.0 | 0 |
| 0.0 | 0 |
| 0.0 | 0 |
| 0.0 | 0 |
| 0.0 | 0 |
| 0.0 | 0 |
| 0.0 | 0 |
| 0.0 | 0 |
| 0.0 | 0 |
| 0.0 | 0 |
| 0.0 | 0 |
| 0.0 | 0 |
| 0.0 | 0 |
| 0.0 | 0 |
| 0.0 | 0 |
| 0.0 | 0 |
| 0.0 | 0 |
| 0.0 | 0 |
| 0.0 | 0 |
| 0.0 | 0 |
| 0.0 | 0 |
| 0.0 | 0 |
| 0.0 | 0 |
| 0.0 | 0 |
| 0.0 | 0 |
| 0.0 | 0 |
| 0.0 | 0 |
| 0.0 | 0 |
| 0.0 | 0 |
| 0.0 | 0 |
| 0.0 | 0 |
| 0.0 | 0 |
| 0.0 | 0 |
| 0.0 | 0 |
| 0.0 | 0 |
| 0.0 | 0 |
| 0.0 | 0 |
| 0.0 | 0 |
| 0.0 | 0 |
| 0.0 | 0 |
| 0.0 | 0 |
| 0.0 | 0 |
| 0.0 | 0 |
| 0.0 | 0 |
| 0.0 | 0 |
| 0.0 | 0 |
| 0.0 | 0 |
| 0.0 | 0 |
| 0.0 | 0 |
| 0.0 | 0 |
| 0.0 | 0 |
| 0.0 | 0 |
| 0.0 | 0 |
| 0.0 | 0 |
| 0.0 | 0 |
| 0.0 | 0 |
| 0.0 | 0 |
| 0.0 | 0 |
| 0.0 | 0 |
| 0.0 | 0 |
| 0.0 | 0 |
| 0.0 | 0 |
| 0.0 | 0 |
| 0.0 | 0 |
| 0.0 | 0 |
| 0.0 | 0 |
| 0.0 | 0 |
| 0.0 | 0 |
| 0.0 | 0 |
| 0.0 | 0 |
| 0.0 | 0 |
| 0.0 | 0 |
| 0.0 | 0 |
| 0.0 | 0 |
| 0.0 | 0 |
| 0.0 | 0 |
| 0.0 | 0 |
| 0.0 | 0 |
| 0.0 | 0 |
| 0.0 | 0 |
| 0.0 | 0 |
| 0.0 | 0 |
| 0.0 | 0 |
| 0.0 | 0 |
| 0.0 | 0 |
| 0.0 | 0 |
| 0.0 | 0 |
| 0.0 | 0 |
| 0.0 | 0 |
| 0.0 | 0 |
| 0.0 | 0 |
| 0.0 | 0 |
| 0.0 | 0 |
| 0.0 | 0 |
| 0.0 | 0 |
| 0.0 | 0 |
| 0.0 | 0 |
| 0.0 | 0 |
| 0.0 | 0 |
| 0.0 | 0 |
| 0.0 | 0 |
| 0.0 | 0 |
| 0.0 | 0 |
| 0.0 | 0 |
| 0.0 | 0 |
| 0.0 | 0 |
| 0.0 | 0 |
| 0.0 | 0 |
| 0.0 | 0 |
| 0.0 | 0 |
| 0.0 | 0 |
| 0.0 | 0 |
| 0.0 | 0 |
| 0.0 | 0 |
| 0.0 | 0 |
| 0.0 | 0 |
| 0.0 | 0 |
| 0.0 | 0 |
| 0.0 | 0 |
| 0.0 | 0 |
| 0.0 | 0 |
| 0.0 | 0 |
| 0.0 | 0 |
| 0.0 | 0 |
| 0.0 | 0 |
| 0.0 | 0 |
| 0.0 | 0 |
| 0.0 | 0 |
| 0.0 | 0 |
| 0.0 | 0 |
| 0.0 | 0 |
| 0.0 | 0 |
| 0.0 | 0 |
| 0.0 | 0 |
| 0.0 | 0 |
| 0.0 | 0 |
| 0.0 | 0 |
| 0.0 | 0 |
| 0.0 | 0 |
| 0.0 | 0 |
| 0.0 | 0 |
| 0.0 | 0 |
| 0.0 | 0 |
| 0.0 | 0 |
| 0.0 | 0 |
| 0.0 | 0 |
| 0.0 | 0 |
| 0.0 | 0 |
| 0.0 | 0 |
| 0.0 | 0 |
| 0.0 | 0 |
| 0.0 | 0 |
| 0.0 | 0 |
| 0.0 | 0 |
| 0.0 | 0 |
| 0.0 | 0 |
| 0.0 | 0 |
| 0.0 | 0 |
| 0.0 | 0 |
| 0.0 | 0 |
| 0.0 | 0 |
| 0.0 | 0 |
| 0.0 | 0 |
| 0.0 | 0 |
| 0.0 | 0 |
| 0.0 | 0 |
| 0.0 | 0 |
| 0.0 | 0 |
| 0.0 | 0 |
| 0.0 | 0 |
| 0.0 | 0 |
| 0.0 | 0 |
| 0.0 | 0 |
| 0.0 | 0 |
| 0.0 | 0 |
| 0.0 | 0 |
| 0.0 | 0 |
| 0.0 | 0 |
| 0.0 | 0 |
| 0.0 | 0 |
| 0.0 | 0 |
| 0.0 | 0 |
| 0.0 | 0 |
| 0.0 | 0 |
| 0.0 | 0 |
| 0.0 | 0 |
| 0.0 | 0 |
| 0.0 | 0 |
| 0.0 | 0 |
| 0.0 | 0 |
| 0.0 | 0 |
| 0.0 | 0 |
| 0.0 | 0 |
| 0.0 | 0 |
| 0.0 | 0 |
| 0.0 | 0 |
| 0.0 | 0 |
| 0.0 | 0 |
| 0.0 | 0 |
| 0.0 | 0 |
| 0.0 | 0 |
| 0.0 | 0 |
| 0.0 | 0 |
| 0.0 | 0 |
| 0.0 | 0 |
| 0.0 | 0 |
| 0.0 | 0 |
| 0.0 | 0 |
| 0.0 | 0 |
| 0.0 | 0 |
| 0.0 | 0 |
| 0.0 | 0 |
| 0.0 | 0 |
| 0.0 | 0 |
| 0.0 | 0 |
| 0.0 | 0 |
| 0.0 | 0 |
| 0.0 | 0 |
| 0.0 | 0 |
| 0.0 | 0 |
| 0.0 | 0 |
| 0.0 | 0 |
| 0.0 | 0 |
| 0.0 | 0 |
| 0.0 | 0 |
| 0.0 | 0 |
| 0.0 | 0 |
| 0.0 | 0 |
| 0.0 | 0 |
| 0.0 | 0 |
| 0.0 | 0 |
| 0.0 | 0 |
| 0.0 | 0 |
| 0.0 | 0 |
| 0.0 | 0 |
| 0.0 | 0 |
| 0.0 | 0 |
| 0.0 | 0 |
| 0.0 | 0 |
| 0.0 | 0 |
| 0.0 | 0 |
| 0.0 | 0 |
| 0.0 | 0 |
| 0.0 | 0 |
| 0.0 | 0 |
| 0.0 | 0 |
| 0.0 | 0 |
| 0.0 | 0 |
| 0.0 | 0 |
| 0.0 | 0 |
| 0.0 | 0 |
| 0.0 | 0 |
| 0.0 | 0 |
| 0.0 | 0 |
| 0.0 | 0 |
| 0.0 | 0 |
| 0.0 | 0 |
| 0.0 | 0 |
| 0.0 | 0 |
| 0.0 | 0 |
| 0.0 | 0 |
| 0.0 | 0 |
| 0.0 | 0 |
| 0.0 | 0 |
| 0.0 | 0 |
| 0.0 | 0 |
| 0.0 | 0 |
| 0.0 | 0 |
| 0.0 | 0 |
| 0.0 | 0 |
| 0.0 | 0 |
| 0.0 | 0 |
| 0.0 | 0 |
| 0.0 | 0 |
| 0.0 | 0 |
| 0.0 | 0 |
| 0.0 | 0 |
| 0.0 | 0 |
| 0.0 | 0 |
| 0.0 | 0 |
| 0.0 | 0 |
| 0.0 | 0 |
| 0.0 | 0 |
| 0.0 | 0 |
| 0.0 | 0 |
| 0.0 | 0 |
| 0.0 | 0 |
| 0.0 | 0 |
| 0.0 | 0 |
| 0.0 | 0 |
| 0.0 | 0 |
| 0.0 | 0 |
| 0.0 | 0 |
| 0.0 | 0 |
| 0.0 | 0 |
| 0.0 | 0 |
| 0.0 | 0 |
| 0.0 | 0 |
| 0.0 | 0 |
| 0.0 | 0 |
| 0.0 | 0 |
| 0.0 | 0 |
| 0.0 | 0 |
| 0.0 | 0 |
| 0.0 | 0 |
| 0.0 | 0 |
| 0.0 | 0 |
| 0.0 | 0 |
| 0.0 | 0 |
| 0.0 | 0 |
| 0.0 | 0 |
| 0.0 | 0 |
| 0.0 | 0 |
| 0.0 | 0 |
| 0.0 | 0 |
| 0.0 | 0 |
| 0.0 | 0 |
| 0.0 | 0 |
| 0.0 | 0 |
| 0.0 | 0 |
| 0.0 | 0 |
| 0.0 | 0 |
| 0.0 | 0 |
| 0.0 | 0 |
| 0.0 | 0 |
| 0.0 | 0 |
| 0.0 | 0 |
| 0.0 | 0 |
| 0.0 | 0 |
| 0.0 | 0 |
| 0.0 | 0 |
| 0.0 | 0 |
| 0.0 | 0 |
| 0.0 | 0 |
| 0.0 | 0 |
| 0.0 | 0 |
| 0.0 | 0 |
| 0.0 | 0 |
| 0.0 | 0 |
| 0.0 | 0 |
| 0.0 | 0 |
| 0.0 | 0 |
| 0.0 | 0 |
| 0.0 | 0 |
| 0.0 | 0 |
| 0.0 | 0 |
| 0.0 | 0 |
| 0.0 | 0 |
| 0.0 | 0 |
| 0.0 | 0 |
| 0.0 | 0 |
| 0.0 | 0 |
| 0.0 | 0 |
| 0.0 | 0 |
| 0.0 | 0 |
| 0.0 | 0 |
| 0.0 | 0 |
| 0.0 | 0 |
| 0.0 | 0 |
| 0.0 | 0 |
| 0.0 | 0 |
| 0.0 | 0 |
| 0.0 | 0 |
| 0.0 | 0 |
| 0.0 | 0 |
| 0.0 | 0 |
| 0.0 | 0 |
| 0.0 | 0 |
| 0.0 | 0 |
| 0.0 | 0 |
| 0.0 | 0 |
| 0.0 | 0 |
| 0.0 | 0 |
| 0.0 | 0 |
| 0.0 | 0 |
| 0.0 | 0 |
| 0.0 | 0 |
| 0.0 | 0 |
| 0.0 | 0 |
| 0.0 | 0 |
| 0.0 | 0 |
| 0.0 | 0 |
| 0.0 | 0 |
| 0.0 | 0 |
| 0.0 | 0 |
| 0.0 | 0 |
| 0.0 | 0 |
| 0.0 | 0 |
| 0.0 | 0 |
| 0.0 | 0 |
| 0.0 | 0 |
| 0.0 | 0 |
| 0.0 | 0 |
| 0.0 | 0 |
| 0.0 | 0 |
| 0.0 | 0 |
| 0.0 | 0 |
| 0.0 | 0 |
| 0.0 | 0 |
| 0.0 | 0 |
| 0.0 | 0 |
| 0.0 | 0 |
| 0.0 | 0 |
| 0.0 | 0 |
| 0.0 | 0 |
| 0.0 | 0 |
| 0.0 | 0 |
| 0.0 | 0 |